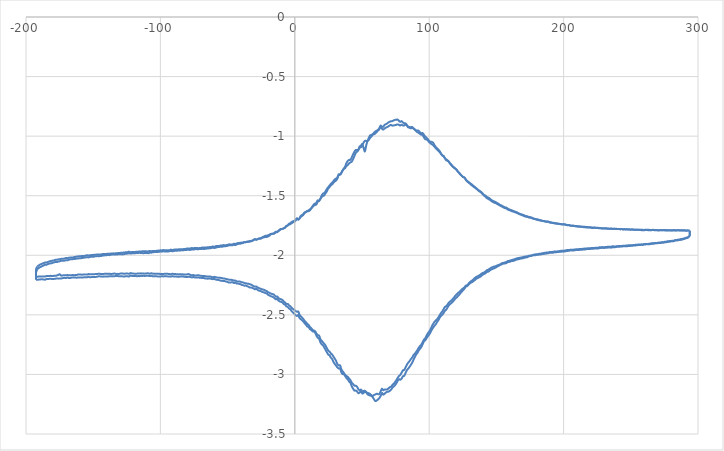
| Category | Paz |
|---|---|
| 293.955 | -1.796 |
| 293.902 | -1.837 |
| 292.948 | -1.849 |
| 291.957 | -1.855 |
| 291.009 | -1.857 |
| 290.032 | -1.862 |
| 289.069 | -1.864 |
| 288.034 | -1.869 |
| 287.135 | -1.87 |
| 286.15 | -1.872 |
| 285.145 | -1.874 |
| 284.209 | -1.876 |
| 283.248 | -1.875 |
| 282.295 | -1.881 |
| 281.279 | -1.882 |
| 280.32 | -1.883 |
| 279.378 | -1.884 |
| 278.414 | -1.886 |
| 277.436 | -1.888 |
| 276.393 | -1.89 |
| 275.456 | -1.891 |
| 274.441 | -1.894 |
| 273.504 | -1.893 |
| 272.506 | -1.896 |
| 271.549 | -1.896 |
| 270.595 | -1.897 |
| 269.598 | -1.9 |
| 268.636 | -1.9 |
| 267.637 | -1.9 |
| 266.683 | -1.903 |
| 265.701 | -1.904 |
| 264.759 | -1.906 |
| 263.772 | -1.908 |
| 262.799 | -1.908 |
| 261.806 | -1.907 |
| 260.847 | -1.909 |
| 259.826 | -1.91 |
| 258.864 | -1.913 |
| 257.899 | -1.912 |
| 256.979 | -1.914 |
| 255.968 | -1.914 |
| 255.02 | -1.915 |
| 254.061 | -1.916 |
| 253.04 | -1.918 |
| 252.121 | -1.918 |
| 251.146 | -1.92 |
| 250.076 | -1.921 |
| 249.11 | -1.923 |
| 248.151 | -1.922 |
| 247.174 | -1.925 |
| 246.221 | -1.924 |
| 245.232 | -1.925 |
| 244.264 | -1.925 |
| 243.271 | -1.927 |
| 242.279 | -1.927 |
| 241.33 | -1.928 |
| 240.326 | -1.928 |
| 239.359 | -1.93 |
| 238.414 | -1.932 |
| 237.425 | -1.933 |
| 236.487 | -1.932 |
| 235.481 | -1.936 |
| 234.478 | -1.934 |
| 233.547 | -1.934 |
| 232.584 | -1.936 |
| 231.557 | -1.938 |
| 230.628 | -1.938 |
| 229.587 | -1.938 |
| 228.645 | -1.937 |
| 227.712 | -1.939 |
| 226.734 | -1.94 |
| 225.695 | -1.942 |
| 224.775 | -1.942 |
| 223.829 | -1.944 |
| 222.788 | -1.944 |
| 221.836 | -1.946 |
| 220.841 | -1.944 |
| 219.909 | -1.948 |
| 218.91 | -1.948 |
| 217.915 | -1.948 |
| 216.955 | -1.949 |
| 215.973 | -1.952 |
| 215.042 | -1.951 |
| 214.017 | -1.953 |
| 213.087 | -1.953 |
| 212.075 | -1.955 |
| 211.123 | -1.955 |
| 210.142 | -1.956 |
| 209.182 | -1.956 |
| 208.203 | -1.958 |
| 207.224 | -1.959 |
| 206.253 | -1.96 |
| 205.292 | -1.958 |
| 204.313 | -1.962 |
| 203.353 | -1.963 |
| 202.426 | -1.963 |
| 201.481 | -1.966 |
| 200.486 | -1.969 |
| 199.432 | -1.968 |
| 198.45 | -1.97 |
| 197.475 | -1.969 |
| 196.547 | -1.972 |
| 195.518 | -1.972 |
| 194.546 | -1.974 |
| 193.574 | -1.974 |
| 192.63 | -1.977 |
| 191.591 | -1.979 |
| 190.628 | -1.979 |
| 189.699 | -1.978 |
| 188.712 | -1.983 |
| 187.728 | -1.984 |
| 186.712 | -1.986 |
| 185.782 | -1.987 |
| 184.761 | -1.989 |
| 183.819 | -1.99 |
| 182.88 | -1.993 |
| 181.876 | -1.993 |
| 180.844 | -1.996 |
| 179.874 | -1.997 |
| 178.94 | -1.999 |
| 178.021 | -1.999 |
| 177.095 | -2.001 |
| 176.04 | -2.004 |
| 175.071 | -2.007 |
| 174.09 | -2.009 |
| 173.117 | -2.016 |
| 172.118 | -2.018 |
| 171.138 | -2.021 |
| 170.188 | -2.023 |
| 169.205 | -2.026 |
| 168.226 | -2.028 |
| 167.217 | -2.031 |
| 166.315 | -2.033 |
| 165.296 | -2.036 |
| 164.347 | -2.039 |
| 163.357 | -2.044 |
| 162.338 | -2.048 |
| 161.389 | -2.048 |
| 160.405 | -2.052 |
| 159.417 | -2.056 |
| 158.505 | -2.057 |
| 157.49 | -2.065 |
| 156.513 | -2.068 |
| 155.569 | -2.069 |
| 154.58 | -2.072 |
| 153.658 | -2.077 |
| 152.673 | -2.082 |
| 151.69 | -2.089 |
| 150.7 | -2.094 |
| 149.706 | -2.101 |
| 148.701 | -2.107 |
| 147.725 | -2.112 |
| 146.706 | -2.117 |
| 145.78 | -2.121 |
| 144.794 | -2.13 |
| 143.791 | -2.138 |
| 142.848 | -2.141 |
| 141.905 | -2.15 |
| 140.952 | -2.156 |
| 139.941 | -2.162 |
| 138.99 | -2.171 |
| 138.029 | -2.18 |
| 137.041 | -2.185 |
| 136.009 | -2.192 |
| 135.054 | -2.197 |
| 134.088 | -2.207 |
| 133.115 | -2.215 |
| 132.192 | -2.224 |
| 131.148 | -2.229 |
| 130.168 | -2.237 |
| 129.164 | -2.248 |
| 128.277 | -2.259 |
| 127.336 | -2.263 |
| 126.322 | -2.279 |
| 125.283 | -2.292 |
| 124.352 | -2.304 |
| 123.373 | -2.316 |
| 122.414 | -2.33 |
| 121.428 | -2.342 |
| 120.464 | -2.354 |
| 119.441 | -2.363 |
| 118.533 | -2.377 |
| 117.568 | -2.388 |
| 116.566 | -2.401 |
| 115.623 | -2.409 |
| 114.632 | -2.42 |
| 113.69 | -2.437 |
| 112.592 | -2.457 |
| 111.669 | -2.466 |
| 110.686 | -2.484 |
| 109.695 | -2.5 |
| 108.794 | -2.508 |
| 107.865 | -2.522 |
| 106.81 | -2.545 |
| 105.863 | -2.56 |
| 104.897 | -2.579 |
| 103.895 | -2.592 |
| 102.969 | -2.607 |
| 101.995 | -2.624 |
| 101.029 | -2.645 |
| 100.036 | -2.664 |
| 98.98 | -2.68 |
| 98.045 | -2.696 |
| 97.036 | -2.713 |
| 96.101 | -2.722 |
| 95.088 | -2.748 |
| 94.091 | -2.771 |
| 93.131 | -2.785 |
| 92.164 | -2.8 |
| 91.169 | -2.821 |
| 90.163 | -2.835 |
| 89.188 | -2.858 |
| 88.257 | -2.879 |
| 87.254 | -2.903 |
| 86.278 | -2.921 |
| 85.319 | -2.937 |
| 84.387 | -2.951 |
| 83.351 | -2.966 |
| 82.401 | -2.988 |
| 81.424 | -3.012 |
| 80.44 | -3.016 |
| 79.494 | -3.036 |
| 78.48 | -3.045 |
| 77.564 | -3.04 |
| 76.559 | -3.053 |
| 75.582 | -3.074 |
| 74.6 | -3.09 |
| 73.649 | -3.1 |
| 72.697 | -3.11 |
| 71.71 | -3.126 |
| 70.676 | -3.138 |
| 69.676 | -3.145 |
| 68.72 | -3.146 |
| 67.814 | -3.152 |
| 66.829 | -3.162 |
| 65.789 | -3.17 |
| 64.882 | -3.155 |
| 63.898 | -3.18 |
| 62.889 | -3.198 |
| 61.874 | -3.21 |
| 60.94 | -3.219 |
| 59.959 | -3.224 |
| 58.971 | -3.209 |
| 58.055 | -3.193 |
| 57.056 | -3.182 |
| 56.063 | -3.177 |
| 55.077 | -3.173 |
| 54.088 | -3.166 |
| 53.227 | -3.153 |
| 52.289 | -3.147 |
| 51.237 | -3.154 |
| 50.192 | -3.16 |
| 49.285 | -3.137 |
| 48.345 | -3.151 |
| 47.244 | -3.157 |
| 46.317 | -3.142 |
| 45.37 | -3.135 |
| 44.348 | -3.136 |
| 43.39 | -3.12 |
| 42.382 | -3.1 |
| 41.443 | -3.071 |
| 40.523 | -3.062 |
| 39.549 | -3.043 |
| 38.578 | -3.032 |
| 37.519 | -3.014 |
| 36.601 | -2.999 |
| 35.603 | -2.997 |
| 34.665 | -2.983 |
| 33.734 | -2.95 |
| 32.7 | -2.95 |
| 31.678 | -2.942 |
| 30.746 | -2.926 |
| 29.755 | -2.912 |
| 28.797 | -2.896 |
| 27.806 | -2.871 |
| 26.843 | -2.859 |
| 25.9 | -2.84 |
| 24.948 | -2.834 |
| 23.903 | -2.815 |
| 22.922 | -2.795 |
| 21.963 | -2.774 |
| 21.028 | -2.757 |
| 20.03 | -2.747 |
| 19.05 | -2.73 |
| 18.053 | -2.7 |
| 17.093 | -2.693 |
| 16.139 | -2.675 |
| 15.174 | -2.651 |
| 14.228 | -2.641 |
| 13.194 | -2.638 |
| 12.235 | -2.626 |
| 11.253 | -2.62 |
| 10.283 | -2.602 |
| 9.321 | -2.598 |
| 8.356 | -2.583 |
| 7.375 | -2.571 |
| 6.397 | -2.556 |
| 5.44 | -2.546 |
| 4.418 | -2.536 |
| 3.508 | -2.527 |
| 2.584 | -2.502 |
| 1.638 | -2.509 |
| 0.634 | -2.503 |
| -0.41 | -2.491 |
| -1.308 | -2.481 |
| -2.285 | -2.47 |
| -3.273 | -2.453 |
| -4.269 | -2.446 |
| -5.263 | -2.433 |
| -6.258 | -2.428 |
| -7.208 | -2.416 |
| -8.232 | -2.408 |
| -9.123 | -2.397 |
| -10.122 | -2.391 |
| -11.117 | -2.388 |
| -12.133 | -2.381 |
| -13.069 | -2.367 |
| -14.061 | -2.369 |
| -15.028 | -2.361 |
| -16.032 | -2.351 |
| -16.962 | -2.346 |
| -17.963 | -2.343 |
| -18.985 | -2.336 |
| -19.947 | -2.331 |
| -20.866 | -2.32 |
| -21.851 | -2.317 |
| -22.827 | -2.312 |
| -23.792 | -2.309 |
| -24.705 | -2.304 |
| -25.732 | -2.299 |
| -26.712 | -2.297 |
| -27.735 | -2.29 |
| -28.645 | -2.281 |
| -29.599 | -2.285 |
| -30.659 | -2.279 |
| -31.61 | -2.274 |
| -32.498 | -2.271 |
| -33.536 | -2.27 |
| -34.487 | -2.263 |
| -35.459 | -2.26 |
| -36.498 | -2.254 |
| -37.444 | -2.255 |
| -38.45 | -2.251 |
| -39.411 | -2.249 |
| -40.329 | -2.243 |
| -41.326 | -2.24 |
| -42.303 | -2.238 |
| -43.306 | -2.237 |
| -44.278 | -2.23 |
| -45.238 | -2.233 |
| -46.231 | -2.227 |
| -47.18 | -2.227 |
| -48.122 | -2.228 |
| -49.161 | -2.229 |
| -50.167 | -2.223 |
| -51.104 | -2.221 |
| -52.089 | -2.217 |
| -53.092 | -2.217 |
| -54.087 | -2.214 |
| -54.999 | -2.214 |
| -56.021 | -2.209 |
| -57.005 | -2.207 |
| -57.999 | -2.205 |
| -58.932 | -2.204 |
| -59.899 | -2.198 |
| -60.896 | -2.2 |
| -61.874 | -2.199 |
| -62.838 | -2.196 |
| -63.84 | -2.194 |
| -64.79 | -2.197 |
| -65.775 | -2.194 |
| -66.73 | -2.195 |
| -67.704 | -2.191 |
| -68.66 | -2.192 |
| -69.665 | -2.189 |
| -70.666 | -2.189 |
| -71.63 | -2.186 |
| -72.508 | -2.186 |
| -73.525 | -2.187 |
| -74.503 | -2.186 |
| -75.444 | -2.182 |
| -76.453 | -2.186 |
| -77.487 | -2.184 |
| -78.414 | -2.181 |
| -79.368 | -2.181 |
| -80.421 | -2.182 |
| -81.404 | -2.181 |
| -82.311 | -2.18 |
| -83.281 | -2.178 |
| -84.212 | -2.178 |
| -85.199 | -2.178 |
| -86.225 | -2.18 |
| -87.222 | -2.18 |
| -88.149 | -2.178 |
| -89.125 | -2.178 |
| -90.127 | -2.178 |
| -91.1 | -2.175 |
| -92.038 | -2.179 |
| -93.017 | -2.178 |
| -93.96 | -2.177 |
| -94.976 | -2.177 |
| -95.948 | -2.177 |
| -96.862 | -2.175 |
| -97.896 | -2.178 |
| -98.87 | -2.176 |
| -99.876 | -2.178 |
| -100.87 | -2.177 |
| -101.78 | -2.178 |
| -102.78 | -2.176 |
| -103.82 | -2.176 |
| -104.75 | -2.177 |
| -105.77 | -2.176 |
| -106.7 | -2.173 |
| -107.68 | -2.175 |
| -108.64 | -2.173 |
| -109.61 | -2.172 |
| -110.59 | -2.172 |
| -111.62 | -2.174 |
| -112.58 | -2.172 |
| -113.57 | -2.173 |
| -114.55 | -2.172 |
| -115.5 | -2.175 |
| -116.49 | -2.174 |
| -117.44 | -2.176 |
| -118.45 | -2.173 |
| -119.42 | -2.174 |
| -120.38 | -2.173 |
| -121.35 | -2.173 |
| -122.26 | -2.17 |
| -123.25 | -2.178 |
| -124.31 | -2.177 |
| -125.26 | -2.176 |
| -126.23 | -2.177 |
| -127.22 | -2.178 |
| -128.19 | -2.177 |
| -129.16 | -2.177 |
| -130.16 | -2.175 |
| -131.1 | -2.175 |
| -132.1 | -2.174 |
| -133.1 | -2.175 |
| -134.03 | -2.175 |
| -135.0 | -2.175 |
| -135.95 | -2.176 |
| -136.96 | -2.177 |
| -137.93 | -2.175 |
| -138.92 | -2.179 |
| -139.93 | -2.177 |
| -140.9 | -2.177 |
| -141.85 | -2.178 |
| -142.8 | -2.179 |
| -143.78 | -2.178 |
| -144.77 | -2.177 |
| -145.7 | -2.175 |
| -146.69 | -2.179 |
| -147.6 | -2.181 |
| -148.62 | -2.183 |
| -149.62 | -2.182 |
| -150.63 | -2.183 |
| -151.59 | -2.183 |
| -152.57 | -2.184 |
| -153.52 | -2.18 |
| -154.51 | -2.185 |
| -155.52 | -2.185 |
| -156.49 | -2.184 |
| -157.42 | -2.186 |
| -158.44 | -2.186 |
| -159.43 | -2.185 |
| -160.34 | -2.187 |
| -161.32 | -2.186 |
| -162.23 | -2.188 |
| -163.3 | -2.187 |
| -164.29 | -2.187 |
| -165.22 | -2.186 |
| -166.16 | -2.188 |
| -167.2 | -2.19 |
| -168.17 | -2.19 |
| -169.12 | -2.187 |
| -170.03 | -2.19 |
| -171.0 | -2.19 |
| -171.99 | -2.19 |
| -172.97 | -2.192 |
| -173.93 | -2.195 |
| -174.97 | -2.194 |
| -175.95 | -2.196 |
| -176.96 | -2.194 |
| -177.95 | -2.197 |
| -178.85 | -2.198 |
| -179.84 | -2.199 |
| -180.82 | -2.198 |
| -181.85 | -2.197 |
| -182.75 | -2.198 |
| -183.76 | -2.199 |
| -184.64 | -2.198 |
| -185.69 | -2.205 |
| -186.68 | -2.203 |
| -187.67 | -2.202 |
| -188.62 | -2.201 |
| -189.59 | -2.204 |
| -190.57 | -2.204 |
| -191.5 | -2.206 |
| -192.51 | -2.204 |
| -192.46 | -2.139 |
| -191.56 | -2.116 |
| -190.6 | -2.108 |
| -189.63 | -2.1 |
| -188.66 | -2.095 |
| -187.67 | -2.09 |
| -186.76 | -2.085 |
| -185.67 | -2.078 |
| -184.73 | -2.079 |
| -183.81 | -2.074 |
| -182.85 | -2.07 |
| -181.84 | -2.068 |
| -180.85 | -2.066 |
| -179.87 | -2.062 |
| -178.94 | -2.059 |
| -177.93 | -2.056 |
| -176.96 | -2.057 |
| -176.02 | -2.053 |
| -175.04 | -2.051 |
| -174.07 | -2.047 |
| -173.05 | -2.047 |
| -172.09 | -2.046 |
| -171.17 | -2.045 |
| -170.13 | -2.041 |
| -169.18 | -2.042 |
| -168.22 | -2.038 |
| -167.24 | -2.035 |
| -166.31 | -2.033 |
| -165.32 | -2.033 |
| -164.35 | -2.03 |
| -163.35 | -2.031 |
| -162.43 | -2.027 |
| -161.41 | -2.027 |
| -160.38 | -2.025 |
| -159.43 | -2.026 |
| -158.5 | -2.023 |
| -157.51 | -2.021 |
| -156.56 | -2.019 |
| -155.54 | -2.018 |
| -154.54 | -2.015 |
| -153.61 | -2.018 |
| -152.68 | -2.014 |
| -151.7 | -2.012 |
| -150.66 | -2.013 |
| -149.67 | -2.012 |
| -148.68 | -2.009 |
| -147.72 | -2.008 |
| -146.71 | -2.007 |
| -145.69 | -2.008 |
| -144.78 | -2.006 |
| -143.86 | -2.005 |
| -142.85 | -2.002 |
| -141.86 | -2.001 |
| -140.94 | -2 |
| -140.0 | -2 |
| -138.95 | -1.996 |
| -137.99 | -1.999 |
| -137.01 | -1.996 |
| -136.06 | -1.994 |
| -135.04 | -1.994 |
| -134.09 | -1.994 |
| -133.12 | -1.994 |
| -132.13 | -1.994 |
| -131.21 | -1.99 |
| -130.16 | -1.991 |
| -129.19 | -1.991 |
| -128.19 | -1.992 |
| -127.26 | -1.99 |
| -126.3 | -1.988 |
| -125.33 | -1.987 |
| -124.35 | -1.986 |
| -123.33 | -1.982 |
| -122.36 | -1.986 |
| -121.43 | -1.984 |
| -120.47 | -1.983 |
| -119.5 | -1.982 |
| -118.51 | -1.982 |
| -117.53 | -1.98 |
| -116.55 | -1.98 |
| -115.57 | -1.98 |
| -114.62 | -1.98 |
| -113.65 | -1.981 |
| -112.63 | -1.983 |
| -111.68 | -1.98 |
| -110.66 | -1.98 |
| -109.73 | -1.981 |
| -108.74 | -1.982 |
| -107.72 | -1.977 |
| -106.8 | -1.978 |
| -105.89 | -1.975 |
| -104.87 | -1.974 |
| -103.83 | -1.972 |
| -102.92 | -1.972 |
| -101.94 | -1.972 |
| -100.96 | -1.971 |
| -99.915 | -1.968 |
| -98.998 | -1.97 |
| -97.944 | -1.966 |
| -96.936 | -1.968 |
| -96.037 | -1.969 |
| -95.066 | -1.969 |
| -94.04 | -1.968 |
| -93.086 | -1.966 |
| -92.07 | -1.963 |
| -91.124 | -1.966 |
| -90.183 | -1.964 |
| -89.183 | -1.962 |
| -88.208 | -1.961 |
| -87.321 | -1.961 |
| -86.33 | -1.96 |
| -85.29 | -1.96 |
| -84.263 | -1.958 |
| -83.296 | -1.959 |
| -82.395 | -1.957 |
| -81.38 | -1.956 |
| -80.41 | -1.955 |
| -79.408 | -1.954 |
| -78.458 | -1.955 |
| -77.506 | -1.954 |
| -76.522 | -1.952 |
| -75.523 | -1.952 |
| -74.586 | -1.95 |
| -73.557 | -1.947 |
| -72.602 | -1.949 |
| -71.662 | -1.949 |
| -70.73 | -1.947 |
| -69.709 | -1.947 |
| -68.743 | -1.946 |
| -67.761 | -1.948 |
| -66.8 | -1.946 |
| -65.837 | -1.944 |
| -64.871 | -1.943 |
| -63.913 | -1.942 |
| -62.918 | -1.94 |
| -61.983 | -1.939 |
| -60.948 | -1.935 |
| -59.935 | -1.938 |
| -58.994 | -1.936 |
| -58.004 | -1.933 |
| -57.101 | -1.931 |
| -56.043 | -1.93 |
| -55.102 | -1.927 |
| -54.111 | -1.928 |
| -53.19 | -1.925 |
| -52.199 | -1.925 |
| -51.188 | -1.923 |
| -50.217 | -1.921 |
| -49.224 | -1.917 |
| -48.23 | -1.915 |
| -47.232 | -1.916 |
| -46.266 | -1.915 |
| -45.309 | -1.911 |
| -44.32 | -1.915 |
| -43.384 | -1.91 |
| -42.376 | -1.906 |
| -41.434 | -1.903 |
| -40.436 | -1.902 |
| -39.521 | -1.899 |
| -38.504 | -1.896 |
| -37.581 | -1.892 |
| -36.513 | -1.89 |
| -35.568 | -1.888 |
| -34.614 | -1.888 |
| -33.643 | -1.885 |
| -32.653 | -1.883 |
| -31.705 | -1.878 |
| -30.756 | -1.873 |
| -29.712 | -1.864 |
| -28.722 | -1.869 |
| -27.759 | -1.866 |
| -26.792 | -1.861 |
| -25.807 | -1.862 |
| -24.9 | -1.859 |
| -23.855 | -1.851 |
| -22.852 | -1.85 |
| -21.906 | -1.846 |
| -20.956 | -1.847 |
| -19.995 | -1.842 |
| -19.023 | -1.837 |
| -18.062 | -1.826 |
| -17.068 | -1.821 |
| -16.089 | -1.82 |
| -15.128 | -1.818 |
| -14.091 | -1.805 |
| -13.143 | -1.806 |
| -12.124 | -1.796 |
| -11.141 | -1.784 |
| -10.179 | -1.779 |
| -9.207 | -1.779 |
| -8.243 | -1.773 |
| -7.307 | -1.767 |
| -6.331 | -1.754 |
| -5.343 | -1.749 |
| -4.322 | -1.736 |
| -3.345 | -1.731 |
| -2.353 | -1.721 |
| -1.389 | -1.715 |
| -0.441 | -1.71 |
| 0.553 | -1.706 |
| 1.596 | -1.69 |
| 2.532 | -1.701 |
| 3.435 | -1.691 |
| 4.419 | -1.67 |
| 5.397 | -1.662 |
| 6.297 | -1.654 |
| 7.321 | -1.64 |
| 8.267 | -1.636 |
| 9.234 | -1.629 |
| 10.223 | -1.631 |
| 11.182 | -1.623 |
| 12.139 | -1.609 |
| 13.125 | -1.595 |
| 14.17 | -1.583 |
| 15.091 | -1.578 |
| 16.107 | -1.573 |
| 17.058 | -1.549 |
| 18.003 | -1.546 |
| 18.991 | -1.527 |
| 19.975 | -1.499 |
| 20.906 | -1.483 |
| 21.88 | -1.478 |
| 22.869 | -1.463 |
| 23.859 | -1.443 |
| 24.904 | -1.428 |
| 25.8 | -1.415 |
| 26.828 | -1.401 |
| 27.805 | -1.391 |
| 28.79 | -1.376 |
| 29.691 | -1.364 |
| 30.645 | -1.357 |
| 31.622 | -1.349 |
| 32.654 | -1.321 |
| 33.583 | -1.32 |
| 34.542 | -1.308 |
| 35.493 | -1.291 |
| 36.468 | -1.272 |
| 37.507 | -1.254 |
| 38.472 | -1.225 |
| 39.401 | -1.208 |
| 40.415 | -1.199 |
| 41.389 | -1.199 |
| 42.358 | -1.179 |
| 43.299 | -1.154 |
| 44.313 | -1.132 |
| 45.322 | -1.116 |
| 46.269 | -1.116 |
| 47.214 | -1.115 |
| 48.225 | -1.087 |
| 49.204 | -1.081 |
| 50.156 | -1.067 |
| 51.211 | -1.1 |
| 52.167 | -1.128 |
| 53.175 | -1.076 |
| 54.059 | -1.042 |
| 55.014 | -1.016 |
| 56.028 | -0.993 |
| 57.039 | -0.99 |
| 58.025 | -0.982 |
| 58.97 | -0.97 |
| 59.933 | -0.961 |
| 60.882 | -0.954 |
| 61.86 | -0.947 |
| 62.81 | -0.935 |
| 63.84 | -0.911 |
| 64.833 | -0.92 |
| 65.772 | -0.922 |
| 66.701 | -0.907 |
| 67.731 | -0.9 |
| 68.687 | -0.894 |
| 69.631 | -0.885 |
| 70.679 | -0.879 |
| 71.52 | -0.874 |
| 72.496 | -0.874 |
| 73.533 | -0.868 |
| 74.51 | -0.864 |
| 75.502 | -0.863 |
| 76.42 | -0.86 |
| 77.422 | -0.871 |
| 78.371 | -0.88 |
| 79.391 | -0.874 |
| 80.352 | -0.884 |
| 81.303 | -0.892 |
| 82.308 | -0.893 |
| 83.287 | -0.904 |
| 84.269 | -0.925 |
| 85.233 | -0.926 |
| 86.176 | -0.926 |
| 87.151 | -0.922 |
| 88.177 | -0.933 |
| 89.136 | -0.941 |
| 90.113 | -0.951 |
| 91.142 | -0.953 |
| 92.097 | -0.954 |
| 93.045 | -0.967 |
| 93.974 | -0.977 |
| 95.011 | -0.973 |
| 96.006 | -0.988 |
| 96.984 | -1.003 |
| 97.877 | -1.012 |
| 98.905 | -1.024 |
| 99.865 | -1.04 |
| 100.894 | -1.046 |
| 101.917 | -1.048 |
| 102.934 | -1.055 |
| 103.805 | -1.073 |
| 104.816 | -1.09 |
| 105.787 | -1.102 |
| 106.763 | -1.112 |
| 107.754 | -1.126 |
| 108.67 | -1.144 |
| 109.633 | -1.161 |
| 110.659 | -1.167 |
| 111.613 | -1.185 |
| 112.579 | -1.201 |
| 113.577 | -1.208 |
| 114.575 | -1.214 |
| 115.466 | -1.229 |
| 116.427 | -1.237 |
| 117.419 | -1.252 |
| 118.374 | -1.264 |
| 119.396 | -1.274 |
| 120.405 | -1.282 |
| 121.348 | -1.298 |
| 122.354 | -1.31 |
| 123.272 | -1.321 |
| 124.275 | -1.333 |
| 125.216 | -1.343 |
| 126.31 | -1.348 |
| 127.255 | -1.367 |
| 128.22 | -1.38 |
| 129.123 | -1.388 |
| 130.091 | -1.397 |
| 131.056 | -1.407 |
| 131.971 | -1.416 |
| 133.019 | -1.425 |
| 133.99 | -1.432 |
| 134.952 | -1.441 |
| 135.969 | -1.45 |
| 136.837 | -1.459 |
| 137.871 | -1.467 |
| 138.903 | -1.476 |
| 139.877 | -1.488 |
| 140.795 | -1.499 |
| 141.799 | -1.507 |
| 142.745 | -1.519 |
| 143.716 | -1.526 |
| 144.684 | -1.532 |
| 145.704 | -1.539 |
| 146.693 | -1.548 |
| 147.66 | -1.553 |
| 148.627 | -1.56 |
| 149.649 | -1.562 |
| 150.567 | -1.569 |
| 151.587 | -1.576 |
| 152.556 | -1.582 |
| 153.587 | -1.588 |
| 154.486 | -1.594 |
| 155.473 | -1.599 |
| 156.439 | -1.605 |
| 157.447 | -1.607 |
| 158.377 | -1.616 |
| 159.391 | -1.62 |
| 160.322 | -1.624 |
| 161.32 | -1.629 |
| 162.282 | -1.633 |
| 163.283 | -1.636 |
| 164.27 | -1.641 |
| 165.243 | -1.644 |
| 166.2 | -1.65 |
| 167.145 | -1.655 |
| 168.129 | -1.659 |
| 169.062 | -1.664 |
| 170.106 | -1.668 |
| 171.089 | -1.673 |
| 171.968 | -1.676 |
| 172.991 | -1.677 |
| 173.949 | -1.683 |
| 174.95 | -1.685 |
| 175.98 | -1.687 |
| 176.924 | -1.691 |
| 177.91 | -1.694 |
| 178.896 | -1.697 |
| 179.835 | -1.701 |
| 180.826 | -1.704 |
| 181.781 | -1.707 |
| 182.768 | -1.707 |
| 183.725 | -1.711 |
| 184.747 | -1.712 |
| 185.669 | -1.715 |
| 186.671 | -1.717 |
| 187.613 | -1.719 |
| 188.633 | -1.719 |
| 189.677 | -1.725 |
| 190.582 | -1.727 |
| 191.562 | -1.728 |
| 192.57 | -1.73 |
| 193.548 | -1.734 |
| 194.471 | -1.734 |
| 195.5 | -1.735 |
| 196.446 | -1.736 |
| 197.486 | -1.739 |
| 198.389 | -1.74 |
| 199.388 | -1.741 |
| 200.337 | -1.742 |
| 201.378 | -1.743 |
| 202.338 | -1.747 |
| 203.254 | -1.748 |
| 204.238 | -1.748 |
| 205.249 | -1.752 |
| 206.206 | -1.751 |
| 207.173 | -1.753 |
| 208.164 | -1.755 |
| 209.117 | -1.758 |
| 210.052 | -1.759 |
| 211.044 | -1.76 |
| 212.048 | -1.76 |
| 213.044 | -1.761 |
| 213.992 | -1.761 |
| 214.948 | -1.764 |
| 215.969 | -1.765 |
| 216.883 | -1.766 |
| 217.807 | -1.766 |
| 218.812 | -1.767 |
| 219.83 | -1.766 |
| 220.823 | -1.77 |
| 221.713 | -1.771 |
| 222.73 | -1.77 |
| 223.743 | -1.77 |
| 224.717 | -1.772 |
| 225.735 | -1.772 |
| 226.674 | -1.774 |
| 227.637 | -1.774 |
| 228.601 | -1.775 |
| 229.528 | -1.775 |
| 230.52 | -1.775 |
| 231.497 | -1.776 |
| 232.481 | -1.777 |
| 233.452 | -1.777 |
| 234.367 | -1.778 |
| 235.404 | -1.777 |
| 236.383 | -1.78 |
| 237.314 | -1.778 |
| 238.308 | -1.778 |
| 239.311 | -1.78 |
| 240.25 | -1.78 |
| 241.247 | -1.78 |
| 242.195 | -1.781 |
| 243.207 | -1.78 |
| 244.175 | -1.783 |
| 245.153 | -1.782 |
| 246.173 | -1.783 |
| 247.096 | -1.782 |
| 248.115 | -1.784 |
| 249.087 | -1.784 |
| 250.037 | -1.785 |
| 251.025 | -1.783 |
| 252.039 | -1.786 |
| 253.027 | -1.786 |
| 253.929 | -1.786 |
| 254.927 | -1.785 |
| 255.92 | -1.787 |
| 256.9 | -1.786 |
| 257.88 | -1.79 |
| 258.847 | -1.789 |
| 259.802 | -1.79 |
| 260.751 | -1.789 |
| 261.719 | -1.789 |
| 262.778 | -1.789 |
| 263.732 | -1.79 |
| 264.682 | -1.79 |
| 265.602 | -1.789 |
| 266.587 | -1.788 |
| 267.579 | -1.79 |
| 268.515 | -1.789 |
| 269.515 | -1.79 |
| 270.545 | -1.791 |
| 271.51 | -1.79 |
| 272.471 | -1.79 |
| 273.398 | -1.79 |
| 274.441 | -1.79 |
| 275.405 | -1.792 |
| 276.321 | -1.791 |
| 277.345 | -1.792 |
| 278.327 | -1.791 |
| 279.285 | -1.791 |
| 280.29 | -1.792 |
| 281.185 | -1.792 |
| 282.214 | -1.79 |
| 283.191 | -1.793 |
| 284.157 | -1.791 |
| 285.085 | -1.79 |
| 286.088 | -1.791 |
| 287.088 | -1.793 |
| 288.036 | -1.791 |
| 289.068 | -1.792 |
| 290.041 | -1.792 |
| 291.001 | -1.794 |
| 291.955 | -1.792 |
| 292.889 | -1.792 |
| 293.874 | -1.792 |
| 293.969 | -1.832 |
| 293.007 | -1.844 |
| 292.004 | -1.851 |
| 291.079 | -1.852 |
| 290.104 | -1.857 |
| 289.088 | -1.859 |
| 288.155 | -1.863 |
| 287.164 | -1.864 |
| 286.17 | -1.868 |
| 285.145 | -1.869 |
| 284.197 | -1.871 |
| 283.278 | -1.871 |
| 282.283 | -1.877 |
| 281.275 | -1.878 |
| 280.378 | -1.879 |
| 279.359 | -1.88 |
| 278.427 | -1.882 |
| 277.43 | -1.882 |
| 276.485 | -1.885 |
| 275.531 | -1.886 |
| 274.494 | -1.89 |
| 273.456 | -1.89 |
| 272.526 | -1.892 |
| 271.576 | -1.893 |
| 270.625 | -1.894 |
| 269.632 | -1.896 |
| 268.628 | -1.897 |
| 267.682 | -1.897 |
| 266.706 | -1.9 |
| 265.678 | -1.899 |
| 264.781 | -1.901 |
| 263.839 | -1.903 |
| 262.839 | -1.905 |
| 261.868 | -1.904 |
| 260.87 | -1.905 |
| 259.877 | -1.906 |
| 258.924 | -1.909 |
| 258.02 | -1.908 |
| 256.96 | -1.909 |
| 255.976 | -1.91 |
| 255.052 | -1.911 |
| 254.044 | -1.912 |
| 253.06 | -1.913 |
| 252.077 | -1.913 |
| 251.198 | -1.916 |
| 250.126 | -1.915 |
| 249.173 | -1.916 |
| 248.183 | -1.916 |
| 247.205 | -1.918 |
| 246.243 | -1.919 |
| 245.255 | -1.919 |
| 244.214 | -1.92 |
| 243.319 | -1.922 |
| 242.298 | -1.922 |
| 241.346 | -1.923 |
| 240.373 | -1.923 |
| 239.428 | -1.924 |
| 238.412 | -1.926 |
| 237.412 | -1.926 |
| 236.492 | -1.924 |
| 235.473 | -1.928 |
| 234.483 | -1.928 |
| 233.55 | -1.928 |
| 232.597 | -1.929 |
| 231.615 | -1.93 |
| 230.65 | -1.932 |
| 229.629 | -1.932 |
| 228.728 | -1.932 |
| 227.699 | -1.932 |
| 226.784 | -1.933 |
| 225.779 | -1.935 |
| 224.833 | -1.937 |
| 223.832 | -1.937 |
| 222.856 | -1.938 |
| 221.897 | -1.938 |
| 220.879 | -1.938 |
| 219.954 | -1.94 |
| 218.956 | -1.941 |
| 217.936 | -1.942 |
| 216.986 | -1.943 |
| 216.044 | -1.944 |
| 215.073 | -1.944 |
| 214.097 | -1.946 |
| 213.149 | -1.947 |
| 212.136 | -1.948 |
| 211.125 | -1.948 |
| 210.133 | -1.949 |
| 209.213 | -1.95 |
| 208.268 | -1.951 |
| 207.241 | -1.953 |
| 206.242 | -1.954 |
| 205.339 | -1.952 |
| 204.383 | -1.956 |
| 203.386 | -1.956 |
| 202.457 | -1.956 |
| 201.459 | -1.959 |
| 200.49 | -1.961 |
| 199.498 | -1.961 |
| 198.473 | -1.962 |
| 197.527 | -1.963 |
| 196.546 | -1.966 |
| 195.582 | -1.967 |
| 194.569 | -1.968 |
| 193.605 | -1.969 |
| 192.658 | -1.969 |
| 191.639 | -1.972 |
| 190.673 | -1.973 |
| 189.758 | -1.972 |
| 188.753 | -1.976 |
| 187.706 | -1.977 |
| 186.75 | -1.978 |
| 185.777 | -1.979 |
| 184.855 | -1.982 |
| 183.87 | -1.984 |
| 182.832 | -1.988 |
| 181.883 | -1.988 |
| 180.91 | -1.99 |
| 179.945 | -1.991 |
| 178.956 | -1.993 |
| 177.975 | -1.994 |
| 177.06 | -1.997 |
| 176.159 | -2.001 |
| 175.089 | -2.003 |
| 174.144 | -2.004 |
| 173.114 | -2.008 |
| 172.102 | -2.01 |
| 171.18 | -2.011 |
| 170.191 | -2.014 |
| 169.199 | -2.017 |
| 168.179 | -2.019 |
| 167.279 | -2.022 |
| 166.241 | -2.022 |
| 165.313 | -2.027 |
| 164.365 | -2.029 |
| 163.343 | -2.034 |
| 162.405 | -2.037 |
| 161.435 | -2.039 |
| 160.438 | -2.043 |
| 159.425 | -2.047 |
| 158.509 | -2.048 |
| 157.53 | -2.055 |
| 156.59 | -2.059 |
| 155.548 | -2.063 |
| 154.558 | -2.065 |
| 153.638 | -2.07 |
| 152.672 | -2.076 |
| 151.73 | -2.081 |
| 150.741 | -2.084 |
| 149.737 | -2.091 |
| 148.719 | -2.093 |
| 147.749 | -2.097 |
| 146.758 | -2.101 |
| 145.827 | -2.107 |
| 144.852 | -2.114 |
| 143.815 | -2.122 |
| 142.885 | -2.126 |
| 141.895 | -2.136 |
| 140.939 | -2.143 |
| 140.004 | -2.148 |
| 139.018 | -2.154 |
| 138.031 | -2.163 |
| 136.981 | -2.17 |
| 136.033 | -2.177 |
| 135.036 | -2.182 |
| 134.052 | -2.19 |
| 133.07 | -2.2 |
| 132.177 | -2.21 |
| 131.141 | -2.218 |
| 130.222 | -2.226 |
| 129.189 | -2.239 |
| 128.243 | -2.251 |
| 127.325 | -2.254 |
| 126.363 | -2.267 |
| 125.346 | -2.277 |
| 124.313 | -2.286 |
| 123.408 | -2.296 |
| 122.367 | -2.308 |
| 121.458 | -2.317 |
| 120.508 | -2.328 |
| 119.503 | -2.339 |
| 118.544 | -2.354 |
| 117.517 | -2.367 |
| 116.558 | -2.379 |
| 115.59 | -2.387 |
| 114.644 | -2.398 |
| 113.624 | -2.413 |
| 112.684 | -2.427 |
| 111.669 | -2.434 |
| 110.746 | -2.452 |
| 109.732 | -2.471 |
| 108.787 | -2.485 |
| 107.843 | -2.502 |
| 106.858 | -2.52 |
| 105.926 | -2.536 |
| 104.929 | -2.548 |
| 103.955 | -2.558 |
| 102.987 | -2.575 |
| 101.988 | -2.597 |
| 100.962 | -2.621 |
| 100.033 | -2.639 |
| 98.974 | -2.655 |
| 97.992 | -2.675 |
| 97.036 | -2.696 |
| 96.097 | -2.707 |
| 95.116 | -2.73 |
| 94.121 | -2.75 |
| 93.152 | -2.762 |
| 92.158 | -2.777 |
| 91.234 | -2.795 |
| 90.212 | -2.812 |
| 89.255 | -2.828 |
| 88.241 | -2.839 |
| 87.338 | -2.858 |
| 86.282 | -2.873 |
| 85.271 | -2.89 |
| 84.363 | -2.902 |
| 83.394 | -2.918 |
| 82.425 | -2.941 |
| 81.416 | -2.962 |
| 80.49 | -2.965 |
| 79.521 | -2.984 |
| 78.521 | -3.004 |
| 77.578 | -3.012 |
| 76.637 | -3.028 |
| 75.572 | -3.048 |
| 74.624 | -3.063 |
| 73.664 | -3.077 |
| 72.663 | -3.088 |
| 71.758 | -3.102 |
| 70.718 | -3.107 |
| 69.781 | -3.116 |
| 68.743 | -3.127 |
| 67.821 | -3.127 |
| 66.804 | -3.127 |
| 65.838 | -3.133 |
| 64.881 | -3.12 |
| 63.951 | -3.141 |
| 62.897 | -3.164 |
| 61.91 | -3.165 |
| 61.008 | -3.162 |
| 59.979 | -3.168 |
| 59.048 | -3.172 |
| 58.07 | -3.18 |
| 57.099 | -3.174 |
| 56.108 | -3.166 |
| 55.17 | -3.158 |
| 54.157 | -3.155 |
| 53.243 | -3.149 |
| 52.289 | -3.138 |
| 51.27 | -3.138 |
| 50.26 | -3.143 |
| 49.297 | -3.128 |
| 48.291 | -3.132 |
| 47.312 | -3.124 |
| 46.334 | -3.104 |
| 45.393 | -3.095 |
| 44.418 | -3.094 |
| 43.404 | -3.081 |
| 42.418 | -3.07 |
| 41.516 | -3.05 |
| 40.507 | -3.037 |
| 39.527 | -3.022 |
| 38.569 | -3.015 |
| 37.573 | -3.005 |
| 36.605 | -2.99 |
| 35.66 | -2.974 |
| 34.633 | -2.957 |
| 33.716 | -2.925 |
| 32.726 | -2.924 |
| 31.76 | -2.914 |
| 30.696 | -2.886 |
| 29.781 | -2.868 |
| 28.811 | -2.851 |
| 27.861 | -2.834 |
| 26.92 | -2.825 |
| 25.935 | -2.81 |
| 24.917 | -2.8 |
| 23.961 | -2.782 |
| 23.023 | -2.761 |
| 22.006 | -2.745 |
| 20.999 | -2.732 |
| 20.073 | -2.719 |
| 19.102 | -2.706 |
| 18.098 | -2.675 |
| 17.125 | -2.67 |
| 16.149 | -2.657 |
| 15.181 | -2.638 |
| 14.26 | -2.632 |
| 13.246 | -2.626 |
| 12.236 | -2.612 |
| 11.313 | -2.602 |
| 10.312 | -2.585 |
| 9.38 | -2.577 |
| 8.396 | -2.562 |
| 7.425 | -2.552 |
| 6.411 | -2.537 |
| 5.508 | -2.524 |
| 4.483 | -2.512 |
| 3.542 | -2.499 |
| 2.625 | -2.472 |
| 1.727 | -2.474 |
| 0.681 | -2.468 |
| -0.335 | -2.459 |
| -1.306 | -2.451 |
| -2.287 | -2.442 |
| -3.263 | -2.428 |
| -4.259 | -2.42 |
| -5.14 | -2.409 |
| -6.173 | -2.408 |
| -7.19 | -2.398 |
| -8.133 | -2.389 |
| -9.103 | -2.376 |
| -10.092 | -2.37 |
| -11.034 | -2.366 |
| -12.09 | -2.36 |
| -13.012 | -2.346 |
| -13.965 | -2.348 |
| -14.991 | -2.336 |
| -15.966 | -2.327 |
| -16.859 | -2.325 |
| -17.931 | -2.321 |
| -18.893 | -2.315 |
| -19.877 | -2.31 |
| -20.844 | -2.301 |
| -21.824 | -2.296 |
| -22.748 | -2.291 |
| -23.738 | -2.287 |
| -24.789 | -2.283 |
| -25.711 | -2.28 |
| -26.69 | -2.276 |
| -27.742 | -2.269 |
| -28.657 | -2.262 |
| -29.575 | -2.263 |
| -30.635 | -2.26 |
| -31.583 | -2.252 |
| -32.538 | -2.247 |
| -33.529 | -2.242 |
| -34.554 | -2.238 |
| -35.409 | -2.238 |
| -36.441 | -2.234 |
| -37.463 | -2.233 |
| -38.467 | -2.228 |
| -39.386 | -2.227 |
| -40.336 | -2.222 |
| -41.312 | -2.22 |
| -42.268 | -2.22 |
| -43.306 | -2.218 |
| -44.265 | -2.212 |
| -45.176 | -2.213 |
| -46.12 | -2.209 |
| -47.147 | -2.206 |
| -48.101 | -2.206 |
| -49.114 | -2.205 |
| -50.059 | -2.202 |
| -51.133 | -2.199 |
| -52.079 | -2.196 |
| -53.031 | -2.195 |
| -54.068 | -2.192 |
| -55.001 | -2.19 |
| -56.023 | -2.188 |
| -56.945 | -2.188 |
| -57.927 | -2.186 |
| -58.959 | -2.184 |
| -59.855 | -2.181 |
| -60.821 | -2.184 |
| -61.885 | -2.182 |
| -62.816 | -2.179 |
| -63.8 | -2.178 |
| -64.783 | -2.178 |
| -65.767 | -2.177 |
| -66.728 | -2.175 |
| -67.655 | -2.174 |
| -68.649 | -2.174 |
| -69.669 | -2.172 |
| -70.569 | -2.171 |
| -71.567 | -2.168 |
| -72.475 | -2.168 |
| -73.48 | -2.17 |
| -74.527 | -2.169 |
| -75.416 | -2.165 |
| -76.367 | -2.169 |
| -77.397 | -2.165 |
| -78.371 | -2.161 |
| -79.316 | -2.157 |
| -80.322 | -2.162 |
| -81.263 | -2.161 |
| -82.292 | -2.162 |
| -83.29 | -2.16 |
| -84.191 | -2.16 |
| -85.156 | -2.158 |
| -86.187 | -2.16 |
| -87.146 | -2.159 |
| -88.128 | -2.158 |
| -89.113 | -2.157 |
| -90.094 | -2.157 |
| -91.095 | -2.155 |
| -92.009 | -2.159 |
| -93.018 | -2.158 |
| -94.004 | -2.156 |
| -94.965 | -2.155 |
| -95.921 | -2.156 |
| -96.845 | -2.155 |
| -97.825 | -2.157 |
| -98.883 | -2.156 |
| -99.818 | -2.158 |
| -100.86 | -2.156 |
| -101.84 | -2.156 |
| -102.77 | -2.154 |
| -103.75 | -2.154 |
| -104.78 | -2.154 |
| -105.72 | -2.154 |
| -106.74 | -2.15 |
| -107.67 | -2.155 |
| -108.65 | -2.152 |
| -109.65 | -2.151 |
| -110.58 | -2.153 |
| -111.61 | -2.154 |
| -112.59 | -2.153 |
| -113.57 | -2.154 |
| -114.52 | -2.152 |
| -115.49 | -2.153 |
| -116.49 | -2.152 |
| -117.44 | -2.154 |
| -118.39 | -2.154 |
| -119.39 | -2.154 |
| -120.36 | -2.153 |
| -121.35 | -2.152 |
| -122.28 | -2.15 |
| -123.21 | -2.155 |
| -124.26 | -2.154 |
| -125.26 | -2.154 |
| -126.25 | -2.154 |
| -127.22 | -2.155 |
| -128.2 | -2.152 |
| -129.12 | -2.154 |
| -130.12 | -2.154 |
| -131.08 | -2.157 |
| -132.13 | -2.156 |
| -133.06 | -2.156 |
| -133.99 | -2.154 |
| -134.95 | -2.154 |
| -135.98 | -2.156 |
| -136.95 | -2.157 |
| -137.91 | -2.154 |
| -138.86 | -2.156 |
| -139.9 | -2.154 |
| -140.83 | -2.154 |
| -141.78 | -2.156 |
| -142.78 | -2.156 |
| -143.78 | -2.156 |
| -144.72 | -2.156 |
| -145.67 | -2.155 |
| -146.64 | -2.156 |
| -147.6 | -2.156 |
| -148.59 | -2.158 |
| -149.62 | -2.158 |
| -150.57 | -2.159 |
| -151.57 | -2.16 |
| -152.57 | -2.16 |
| -153.51 | -2.158 |
| -154.45 | -2.162 |
| -155.47 | -2.16 |
| -156.43 | -2.161 |
| -157.42 | -2.161 |
| -158.37 | -2.163 |
| -159.41 | -2.161 |
| -160.36 | -2.162 |
| -161.33 | -2.162 |
| -162.26 | -2.166 |
| -163.32 | -2.165 |
| -164.24 | -2.167 |
| -165.23 | -2.166 |
| -166.2 | -2.167 |
| -167.14 | -2.169 |
| -168.2 | -2.168 |
| -169.08 | -2.166 |
| -170.1 | -2.168 |
| -171.07 | -2.168 |
| -172.0 | -2.168 |
| -172.97 | -2.169 |
| -173.97 | -2.17 |
| -174.95 | -2.159 |
| -175.96 | -2.165 |
| -176.94 | -2.169 |
| -177.91 | -2.172 |
| -178.86 | -2.172 |
| -179.81 | -2.174 |
| -180.8 | -2.174 |
| -181.82 | -2.172 |
| -182.79 | -2.175 |
| -183.71 | -2.175 |
| -184.68 | -2.174 |
| -185.65 | -2.178 |
| -186.61 | -2.177 |
| -187.6 | -2.178 |
| -188.57 | -2.177 |
| -189.6 | -2.178 |
| -190.58 | -2.178 |
| -191.51 | -2.18 |
| -192.49 | -2.178 |
| -192.57 | -2.116 |
| -191.6 | -2.094 |
| -190.69 | -2.087 |
| -189.71 | -2.079 |
| -188.69 | -2.074 |
| -187.79 | -2.07 |
| -186.82 | -2.066 |
| -185.81 | -2.06 |
| -184.79 | -2.061 |
| -183.87 | -2.057 |
| -182.92 | -2.053 |
| -181.91 | -2.049 |
| -180.96 | -2.047 |
| -179.94 | -2.044 |
| -178.94 | -2.043 |
| -178.03 | -2.038 |
| -177.07 | -2.038 |
| -176.08 | -2.035 |
| -175.09 | -2.034 |
| -174.13 | -2.03 |
| -173.12 | -2.03 |
| -172.14 | -2.029 |
| -171.19 | -2.027 |
| -170.23 | -2.023 |
| -169.26 | -2.024 |
| -168.34 | -2.021 |
| -167.31 | -2.019 |
| -166.33 | -2.019 |
| -165.33 | -2.019 |
| -164.4 | -2.016 |
| -163.42 | -2.015 |
| -162.43 | -2.011 |
| -161.48 | -2.01 |
| -160.51 | -2.008 |
| -159.49 | -2.008 |
| -158.52 | -2.006 |
| -157.56 | -2.006 |
| -156.59 | -2.005 |
| -155.68 | -2.003 |
| -154.67 | -1.999 |
| -153.65 | -2.003 |
| -152.73 | -2.001 |
| -151.73 | -1.999 |
| -150.72 | -1.998 |
| -149.76 | -1.997 |
| -148.71 | -1.995 |
| -147.8 | -1.995 |
| -146.81 | -1.993 |
| -145.8 | -1.994 |
| -144.86 | -1.994 |
| -143.94 | -1.992 |
| -142.95 | -1.99 |
| -141.96 | -1.99 |
| -141.0 | -1.99 |
| -140.02 | -1.989 |
| -139.02 | -1.986 |
| -138.06 | -1.988 |
| -137.08 | -1.986 |
| -136.12 | -1.984 |
| -135.1 | -1.984 |
| -134.14 | -1.985 |
| -133.23 | -1.983 |
| -132.23 | -1.983 |
| -131.26 | -1.98 |
| -130.26 | -1.981 |
| -129.31 | -1.978 |
| -128.34 | -1.979 |
| -127.35 | -1.977 |
| -126.41 | -1.976 |
| -125.45 | -1.974 |
| -124.44 | -1.974 |
| -123.44 | -1.97 |
| -122.4 | -1.974 |
| -121.49 | -1.973 |
| -120.47 | -1.972 |
| -119.58 | -1.972 |
| -118.57 | -1.972 |
| -117.61 | -1.969 |
| -116.61 | -1.97 |
| -115.58 | -1.968 |
| -114.73 | -1.969 |
| -113.69 | -1.967 |
| -112.72 | -1.967 |
| -111.76 | -1.966 |
| -110.77 | -1.966 |
| -109.76 | -1.968 |
| -108.86 | -1.966 |
| -107.86 | -1.964 |
| -106.8 | -1.967 |
| -105.94 | -1.964 |
| -104.89 | -1.964 |
| -103.89 | -1.964 |
| -102.95 | -1.963 |
| -101.95 | -1.962 |
| -101.03 | -1.96 |
| -100.0 | -1.958 |
| -98.98 | -1.959 |
| -98.027 | -1.956 |
| -97.025 | -1.958 |
| -96.05 | -1.958 |
| -95.047 | -1.958 |
| -94.071 | -1.957 |
| -93.19 | -1.957 |
| -92.186 | -1.952 |
| -91.166 | -1.956 |
| -90.207 | -1.954 |
| -89.248 | -1.952 |
| -88.252 | -1.952 |
| -87.315 | -1.952 |
| -86.257 | -1.95 |
| -85.307 | -1.949 |
| -84.374 | -1.948 |
| -83.406 | -1.949 |
| -82.454 | -1.947 |
| -81.493 | -1.947 |
| -80.489 | -1.944 |
| -79.507 | -1.944 |
| -78.56 | -1.944 |
| -77.6 | -1.942 |
| -76.59 | -1.939 |
| -75.575 | -1.942 |
| -74.633 | -1.939 |
| -73.665 | -1.939 |
| -72.715 | -1.939 |
| -71.662 | -1.94 |
| -70.719 | -1.938 |
| -69.817 | -1.938 |
| -68.81 | -1.935 |
| -67.807 | -1.936 |
| -66.85 | -1.934 |
| -65.879 | -1.935 |
| -64.925 | -1.932 |
| -63.944 | -1.932 |
| -62.995 | -1.93 |
| -62.003 | -1.93 |
| -60.983 | -1.926 |
| -60.036 | -1.93 |
| -59.112 | -1.925 |
| -58.081 | -1.922 |
| -57.089 | -1.922 |
| -56.145 | -1.921 |
| -55.182 | -1.918 |
| -54.185 | -1.918 |
| -53.225 | -1.914 |
| -52.26 | -1.916 |
| -51.297 | -1.915 |
| -50.303 | -1.913 |
| -49.243 | -1.909 |
| -48.313 | -1.908 |
| -47.256 | -1.91 |
| -46.408 | -1.909 |
| -45.346 | -1.903 |
| -44.387 | -1.906 |
| -43.454 | -1.902 |
| -42.489 | -1.898 |
| -41.524 | -1.896 |
| -40.516 | -1.895 |
| -39.603 | -1.894 |
| -38.621 | -1.892 |
| -37.668 | -1.889 |
| -36.659 | -1.89 |
| -35.637 | -1.885 |
| -34.639 | -1.884 |
| -33.7 | -1.881 |
| -32.684 | -1.879 |
| -31.792 | -1.878 |
| -30.801 | -1.873 |
| -29.787 | -1.865 |
| -28.787 | -1.869 |
| -27.843 | -1.865 |
| -26.862 | -1.86 |
| -25.883 | -1.857 |
| -24.881 | -1.855 |
| -23.935 | -1.847 |
| -22.986 | -1.843 |
| -21.962 | -1.837 |
| -21.019 | -1.836 |
| -20.066 | -1.833 |
| -19.096 | -1.828 |
| -18.128 | -1.821 |
| -17.115 | -1.819 |
| -16.163 | -1.816 |
| -15.166 | -1.813 |
| -14.194 | -1.802 |
| -13.189 | -1.802 |
| -12.276 | -1.796 |
| -11.223 | -1.789 |
| -10.266 | -1.781 |
| -9.296 | -1.779 |
| -8.344 | -1.774 |
| -7.316 | -1.769 |
| -6.394 | -1.756 |
| -5.397 | -1.751 |
| -4.434 | -1.743 |
| -3.499 | -1.739 |
| -2.424 | -1.732 |
| -1.482 | -1.724 |
| -0.478 | -1.718 |
| 0.5 | -1.711 |
| 1.499 | -1.691 |
| 2.487 | -1.7 |
| 3.353 | -1.693 |
| 4.324 | -1.678 |
| 5.286 | -1.67 |
| 6.309 | -1.661 |
| 7.22 | -1.646 |
| 8.218 | -1.638 |
| 9.187 | -1.629 |
| 10.156 | -1.624 |
| 11.105 | -1.615 |
| 12.075 | -1.607 |
| 13.012 | -1.592 |
| 14.085 | -1.575 |
| 15.065 | -1.565 |
| 15.99 | -1.561 |
| 16.912 | -1.54 |
| 17.951 | -1.54 |
| 18.908 | -1.529 |
| 19.895 | -1.511 |
| 20.87 | -1.503 |
| 21.812 | -1.498 |
| 22.805 | -1.48 |
| 23.792 | -1.465 |
| 24.77 | -1.441 |
| 25.772 | -1.429 |
| 26.728 | -1.414 |
| 27.74 | -1.405 |
| 28.658 | -1.393 |
| 29.64 | -1.381 |
| 30.575 | -1.374 |
| 31.57 | -1.358 |
| 32.572 | -1.328 |
| 33.611 | -1.325 |
| 34.506 | -1.313 |
| 35.444 | -1.289 |
| 36.403 | -1.277 |
| 37.44 | -1.268 |
| 38.379 | -1.251 |
| 39.373 | -1.243 |
| 40.328 | -1.229 |
| 41.315 | -1.221 |
| 42.271 | -1.215 |
| 43.284 | -1.196 |
| 44.218 | -1.171 |
| 45.191 | -1.145 |
| 46.2 | -1.132 |
| 47.138 | -1.12 |
| 48.119 | -1.098 |
| 49.122 | -1.094 |
| 50.039 | -1.081 |
| 51.107 | -1.055 |
| 52.115 | -1.04 |
| 53.081 | -1.04 |
| 54.005 | -1.041 |
| 54.979 | -1.032 |
| 55.925 | -1.016 |
| 56.961 | -1.004 |
| 57.887 | -0.989 |
| 58.864 | -0.985 |
| 59.825 | -0.979 |
| 60.812 | -0.967 |
| 61.771 | -0.954 |
| 62.727 | -0.945 |
| 63.764 | -0.923 |
| 64.719 | -0.935 |
| 65.652 | -0.945 |
| 66.67 | -0.937 |
| 67.636 | -0.929 |
| 68.554 | -0.925 |
| 69.559 | -0.918 |
| 70.511 | -0.911 |
| 71.53 | -0.905 |
| 72.501 | -0.912 |
| 73.474 | -0.91 |
| 74.466 | -0.908 |
| 75.445 | -0.905 |
| 76.453 | -0.901 |
| 77.434 | -0.905 |
| 78.337 | -0.911 |
| 79.357 | -0.904 |
| 80.334 | -0.91 |
| 81.269 | -0.911 |
| 82.225 | -0.903 |
| 83.27 | -0.91 |
| 84.144 | -0.918 |
| 85.133 | -0.925 |
| 86.108 | -0.934 |
| 87.129 | -0.932 |
| 88.129 | -0.936 |
| 89.113 | -0.945 |
| 90.043 | -0.956 |
| 91.033 | -0.966 |
| 92.011 | -0.971 |
| 92.925 | -0.979 |
| 93.932 | -0.987 |
| 94.922 | -0.989 |
| 95.935 | -1.007 |
| 96.858 | -1.024 |
| 97.816 | -1.028 |
| 98.865 | -1.034 |
| 99.798 | -1.049 |
| 100.825 | -1.058 |
| 101.836 | -1.068 |
| 102.81 | -1.075 |
| 103.775 | -1.087 |
| 104.679 | -1.098 |
| 105.684 | -1.111 |
| 106.696 | -1.123 |
| 107.727 | -1.133 |
| 108.655 | -1.146 |
| 109.595 | -1.16 |
| 110.528 | -1.166 |
| 111.508 | -1.182 |
| 112.492 | -1.194 |
| 113.492 | -1.201 |
| 114.458 | -1.212 |
| 115.467 | -1.228 |
| 116.407 | -1.244 |
| 117.387 | -1.256 |
| 118.365 | -1.262 |
| 119.304 | -1.271 |
| 120.294 | -1.282 |
| 121.282 | -1.296 |
| 122.243 | -1.308 |
| 123.22 | -1.321 |
| 124.219 | -1.333 |
| 125.2 | -1.343 |
| 126.173 | -1.348 |
| 127.202 | -1.362 |
| 128.107 | -1.374 |
| 129.034 | -1.382 |
| 130.044 | -1.392 |
| 131.005 | -1.4 |
| 132.017 | -1.408 |
| 132.973 | -1.418 |
| 133.868 | -1.426 |
| 134.936 | -1.436 |
| 135.875 | -1.446 |
| 136.872 | -1.455 |
| 137.81 | -1.461 |
| 138.853 | -1.47 |
| 139.848 | -1.482 |
| 140.741 | -1.494 |
| 141.771 | -1.498 |
| 142.717 | -1.509 |
| 143.686 | -1.514 |
| 144.684 | -1.52 |
| 145.676 | -1.53 |
| 146.613 | -1.539 |
| 147.586 | -1.544 |
| 148.597 | -1.549 |
| 149.521 | -1.554 |
| 150.544 | -1.562 |
| 151.58 | -1.568 |
| 152.548 | -1.576 |
| 153.504 | -1.581 |
| 154.505 | -1.587 |
| 155.418 | -1.592 |
| 156.406 | -1.598 |
| 157.402 | -1.6 |
| 158.366 | -1.608 |
| 159.319 | -1.613 |
| 160.307 | -1.618 |
| 161.288 | -1.622 |
| 162.273 | -1.627 |
| 163.216 | -1.631 |
| 164.184 | -1.635 |
| 165.168 | -1.639 |
| 166.188 | -1.646 |
| 167.067 | -1.65 |
| 168.109 | -1.655 |
| 169.063 | -1.658 |
| 170.052 | -1.662 |
| 170.991 | -1.667 |
| 171.983 | -1.67 |
| 172.959 | -1.673 |
| 173.961 | -1.678 |
| 174.938 | -1.68 |
| 175.938 | -1.682 |
| 176.903 | -1.687 |
| 177.91 | -1.692 |
| 178.835 | -1.695 |
| 179.82 | -1.697 |
| 180.788 | -1.699 |
| 181.739 | -1.702 |
| 182.704 | -1.705 |
| 183.675 | -1.709 |
| 184.62 | -1.711 |
| 185.626 | -1.713 |
| 186.568 | -1.716 |
| 187.588 | -1.717 |
| 188.62 | -1.717 |
| 189.577 | -1.722 |
| 190.525 | -1.724 |
| 191.441 | -1.726 |
| 192.481 | -1.728 |
| 193.463 | -1.73 |
| 194.438 | -1.732 |
| 195.356 | -1.734 |
| 196.414 | -1.735 |
| 197.363 | -1.738 |
| 198.34 | -1.738 |
| 199.331 | -1.74 |
| 200.303 | -1.74 |
| 201.335 | -1.741 |
| 202.247 | -1.746 |
| 203.212 | -1.747 |
| 204.218 | -1.747 |
| 205.173 | -1.751 |
| 206.15 | -1.752 |
| 207.093 | -1.751 |
| 208.096 | -1.753 |
| 209.083 | -1.755 |
| 210.048 | -1.755 |
| 211.039 | -1.757 |
| 211.93 | -1.757 |
| 212.999 | -1.76 |
| 213.973 | -1.76 |
| 214.878 | -1.76 |
| 215.862 | -1.761 |
| 216.85 | -1.763 |
| 217.845 | -1.763 |
| 218.762 | -1.765 |
| 219.803 | -1.764 |
| 220.767 | -1.766 |
| 221.707 | -1.767 |
| 222.637 | -1.767 |
| 223.702 | -1.768 |
| 224.628 | -1.768 |
| 225.643 | -1.769 |
| 226.631 | -1.771 |
| 227.587 | -1.772 |
| 228.507 | -1.774 |
| 229.497 | -1.773 |
| 230.454 | -1.774 |
| 231.47 | -1.773 |
| 232.49 | -1.775 |
| 233.384 | -1.776 |
| 234.335 | -1.777 |
| 235.333 | -1.776 |
| 236.308 | -1.778 |
| 237.265 | -1.777 |
| 238.29 | -1.777 |
| 239.232 | -1.778 |
| 240.237 | -1.779 |
| 241.195 | -1.779 |
| 242.184 | -1.781 |
| 243.123 | -1.78 |
| 244.122 | -1.782 |
| 245.111 | -1.781 |
| 246.084 | -1.782 |
| 247.092 | -1.782 |
| 248.059 | -1.783 |
| 249.04 | -1.782 |
| 249.97 | -1.784 |
| 251.049 | -1.783 |
| 252.034 | -1.784 |
| 252.921 | -1.785 |
| 253.888 | -1.786 |
| 254.855 | -1.785 |
| 255.827 | -1.786 |
| 256.832 | -1.786 |
| 257.767 | -1.786 |
| 258.749 | -1.786 |
| 259.717 | -1.787 |
| 260.672 | -1.786 |
| 261.647 | -1.786 |
| 262.651 | -1.786 |
| 263.673 | -1.786 |
| 264.643 | -1.788 |
| 265.633 | -1.788 |
| 266.539 | -1.786 |
| 267.549 | -1.788 |
| 268.491 | -1.788 |
| 269.506 | -1.789 |
| 270.46 | -1.79 |
| 271.408 | -1.789 |
| 272.399 | -1.788 |
| 273.404 | -1.789 |
| 274.36 | -1.788 |
| 275.399 | -1.788 |
| 276.361 | -1.788 |
| 277.217 | -1.79 |
| 278.265 | -1.789 |
| 279.238 | -1.79 |
| 280.215 | -1.79 |
| 281.186 | -1.79 |
| 282.172 | -1.788 |
| 283.174 | -1.791 |
| 284.084 | -1.791 |
| 285.051 | -1.79 |
| 286.051 | -1.79 |
| 287.007 | -1.79 |
| 287.992 | -1.79 |
| 288.938 | -1.791 |
| 289.993 | -1.79 |
| 290.941 | -1.792 |
| 291.904 | -1.792 |
| 292.874 | -1.792 |